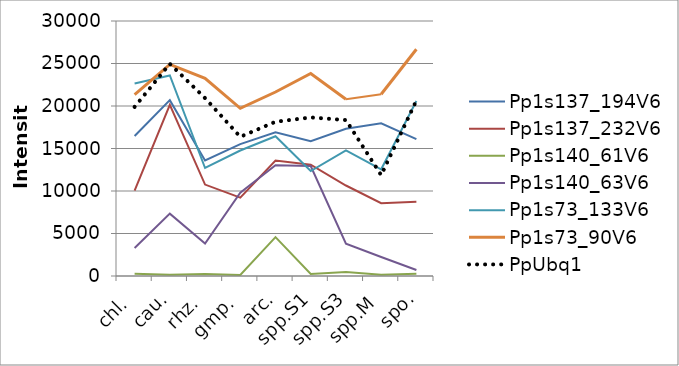
| Category | Pp1s137_194V6 | Pp1s137_232V6 | Pp1s140_61V6 | Pp1s140_63V6 | Pp1s73_133V6 | Pp1s73_90V6 | PpUbq1 |
|---|---|---|---|---|---|---|---|
| chl. | 16470.2 | 10047.5 | 265.57 | 3289.29 | 22652.4 | 21341.8 | 19893.7 |
| cau. | 20689 | 20133.2 | 151.65 | 7338.28 | 23599.5 | 24885.6 | 24963.3 |
| rhz. | 13601.7 | 10756.8 | 230.19 | 3820.49 | 12707.2 | 23251.8 | 20931.4 |
| gmp. | 15513.4 | 9219.33 | 117.53 | 9807.09 | 14765.2 | 19731.9 | 16371.5 |
| arc. | 16900.09 | 13582.2 | 4574.43 | 13024.8 | 16446.4 | 21644.1 | 18146 |
| spp.S1 | 15870.8 | 13092.6 | 236.43 | 12935.8 | 12351.2 | 23824.8 | 18655.59 |
| spp.S3 | 17323 | 10646.7 | 484.09 | 3812.73 | 14766 | 20786.4 | 18345.9 |
| spp.M | 17970.59 | 8563.77 | 159.47 | 2231.63 | 12550.3 | 21387.7 | 11864.2 |
| spo. | 16104.1 | 8740.04 | 256.2 | 700.28 | 20590.2 | 26680.6 | 20640.8 |